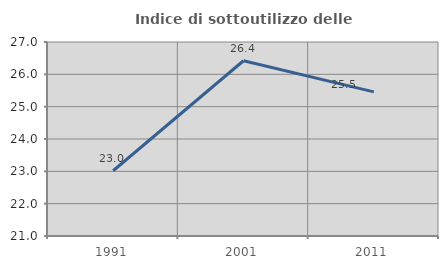
| Category | Indice di sottoutilizzo delle abitazioni  |
|---|---|
| 1991.0 | 23.018 |
| 2001.0 | 26.42 |
| 2011.0 | 25.457 |